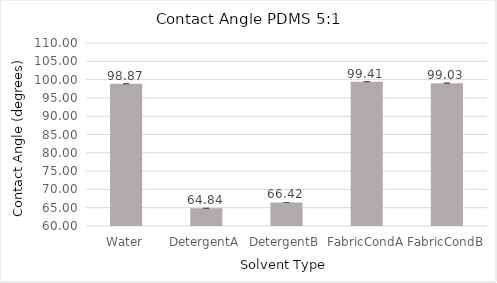
| Category | Series 0 |
|---|---|
| Water | 98.87 |
| DetergentA | 64.84 |
| DetergentB | 66.423 |
| FabricCondA | 99.413 |
| FabricCondB | 99.033 |